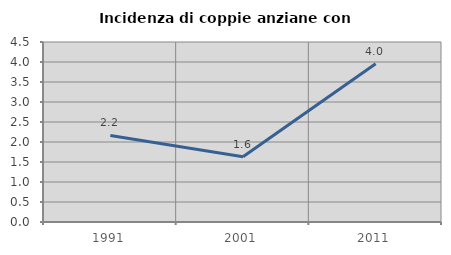
| Category | Incidenza di coppie anziane con figli |
|---|---|
| 1991.0 | 2.165 |
| 2001.0 | 1.633 |
| 2011.0 | 3.956 |